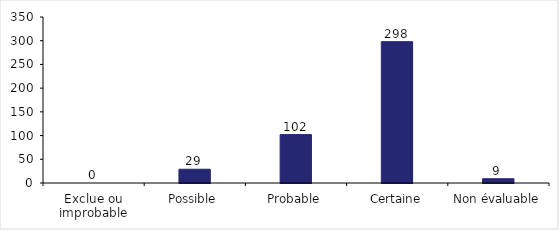
| Category | Series 0 |
|---|---|
| Exclue ou improbable | 0 |
| Possible | 29 |
| Probable | 102 |
| Certaine | 298 |
| Non évaluable | 9 |